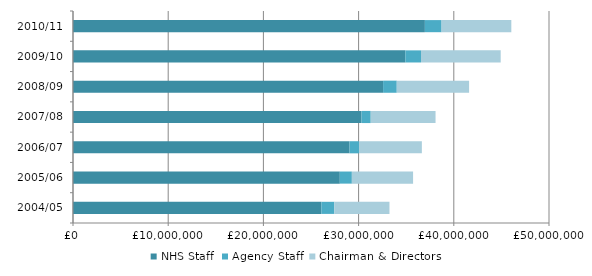
| Category | NHS Staff | Agency Staff | Chairman & Directors |
|---|---|---|---|
| 2004/05 | 26085037.645 | 1365244.614 | 5793300.516 |
| 2005/06 | 28027090.5 | 1264450.5 | 6431297.815 |
| 2006/07 | 29049856 | 995330 | 6599301.125 |
| 2007/08 | 30306044.702 | 967707.298 | 6808830 |
| 2008/09 | 32572379.14 | 1435736.743 | 7597741.557 |
| 2009/10 | 34911729.862 | 1643244.895 | 8370123.368 |
| 2010/11 | 36962626 | 1753583 | 7326514 |